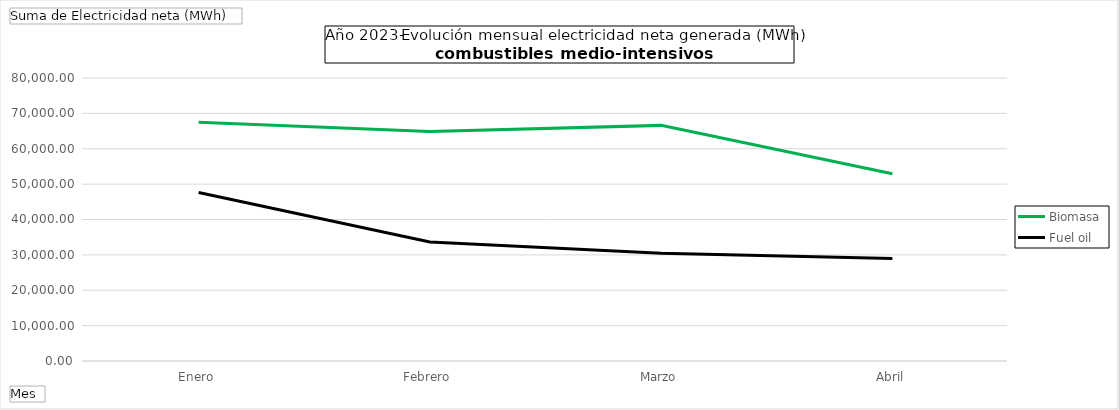
| Category | Biomasa | Fuel oil |
|---|---|---|
| Enero | 67468.3 | 47619.02 |
| Febrero | 64886.92 | 33661.83 |
| Marzo | 66606.9 | 30445.68 |
| Abril | 52933.86 | 28951.76 |